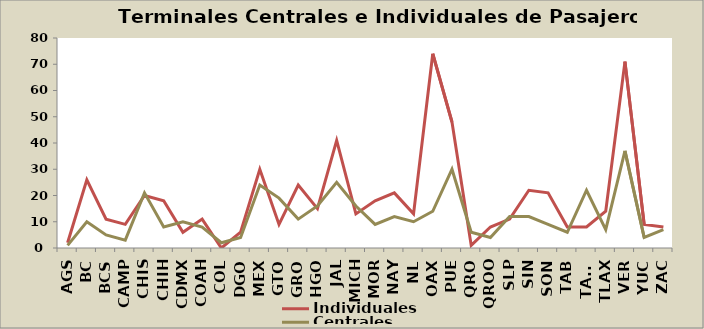
| Category | Individuales | Centrales |
|---|---|---|
| AGS | 2 | 1 |
| BC | 26 | 10 |
| BCS | 11 | 5 |
| CAMP | 9 | 3 |
| CHIS | 20 | 21 |
| CHIH | 18 | 8 |
| CDMX | 6 | 10 |
| COAH | 11 | 8 |
| COL | 0 | 2 |
| DGO | 6 | 4 |
| MEX | 30 | 24 |
| GTO | 9 | 19 |
| GRO | 24 | 11 |
| HGO | 15 | 16 |
| JAL | 41 | 25 |
| MICH | 13 | 16 |
| MOR | 18 | 9 |
| NAY | 21 | 12 |
| NL | 13 | 10 |
| OAX | 74 | 14 |
| PUE | 48 | 30 |
| QRO | 1 | 6 |
| QROO | 8 | 4 |
| SLP | 11 | 12 |
| SIN | 22 | 12 |
| SON | 21 | 9 |
| TAB | 8 | 6 |
| TAMS | 8 | 22 |
| TLAX | 14 | 7 |
| VER | 71 | 37 |
| YUC | 9 | 4 |
| ZAC | 8 | 7 |